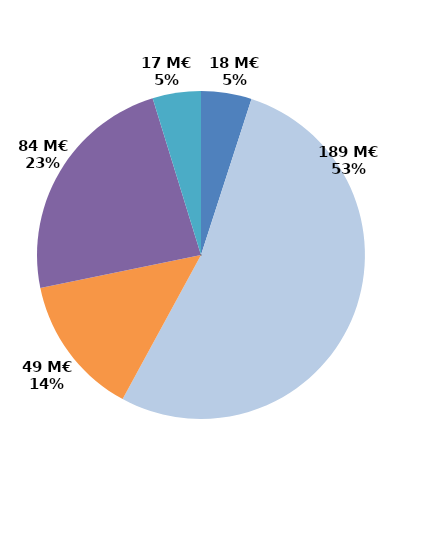
| Category | Series 0 |
|---|---|
| Contrats aidés marchand (hors IAE) | 17.753 |
| Contrats aidés non marchand (hors IAE) | 188.638 |
| Insertion par l'activité économique | 49.361 |
| Mesures en faveur des handicapés | 83.556 |
| Autres emplois aidés | 16.97 |